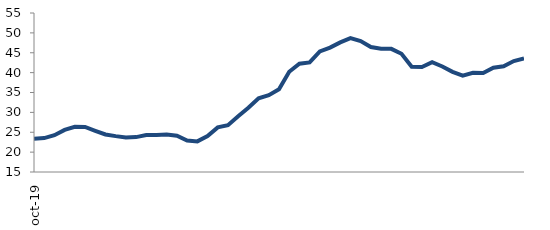
| Category | Series 0 |
|---|---|
| 2019-10-01 | 23.369 |
| 2019-11-01 | 23.525 |
| 2019-12-01 | 24.256 |
| 2020-01-01 | 25.597 |
| 2020-02-01 | 26.375 |
| 2020-03-01 | 26.322 |
| 2020-04-01 | 25.369 |
| 2020-05-01 | 24.446 |
| 2020-06-01 | 24.028 |
| 2020-07-01 | 23.685 |
| 2020-08-01 | 23.782 |
| 2020-09-01 | 24.28 |
| 2020-10-01 | 24.323 |
| 2020-11-01 | 24.433 |
| 2020-12-01 | 24.131 |
| 2021-01-01 | 22.928 |
| 2021-02-01 | 22.701 |
| 2021-03-01 | 24.039 |
| 2021-04-01 | 26.229 |
| 2021-05-01 | 26.758 |
| 2021-06-01 | 29.013 |
| 2021-07-01 | 31.153 |
| 2021-08-01 | 33.54 |
| 2021-09-01 | 34.33 |
| 2021-10-01 | 35.804 |
| 2021-11-01 | 40.209 |
| 2021-12-01 | 42.248 |
| 2022-01-01 | 42.562 |
| 2022-02-01 | 45.314 |
| 2022-03-01 | 46.285 |
| 2022-04-01 | 47.614 |
| 2022-05-01 | 48.674 |
| 2022-06-01 | 47.931 |
| 2022-07-01 | 46.442 |
| 2022-08-01 | 46 |
| 2022-09-01 | 45.983 |
| 2022-10-01 | 44.739 |
| 2022-11-01 | 41.492 |
| 2022-12-01 | 41.391 |
| 2023-01-01 | 42.634 |
| 2023-02-01 | 41.54 |
| 2023-03-01 | 40.198 |
| 2023-04-01 | 39.238 |
| 2023-05-01 | 39.944 |
| 2023-06-01 | 39.891 |
| 2023-07-01 | 41.221 |
| 2023-08-01 | 41.581 |
| 2023-09-01 | 42.921 |
| 2023-10-01 | 43.562 |